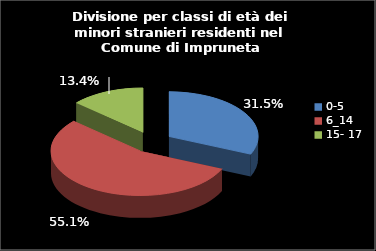
| Category | Series 0 |
|---|---|
| 0-5 | 87 |
| 6_14 | 152 |
| 15- 17 | 37 |